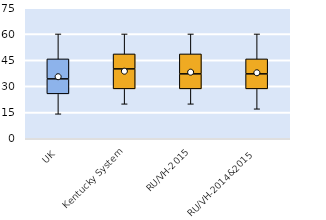
| Category | 25th | 50th | 75th |
|---|---|---|---|
| UK | 25.714 | 8.571 | 11.429 |
| Kentucky System | 28.571 | 11.429 | 8.571 |
| RU/VH-2015 | 28.571 | 8.571 | 11.429 |
| RU/VH-2014&2015 | 28.571 | 8.571 | 8.571 |